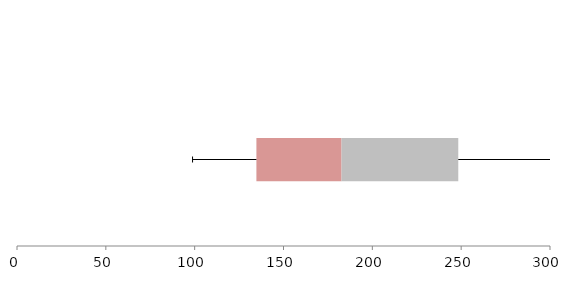
| Category | Series 1 | Series 2 | Series 3 |
|---|---|---|---|
| 0 | 134.75 | 47.918 | 65.706 |